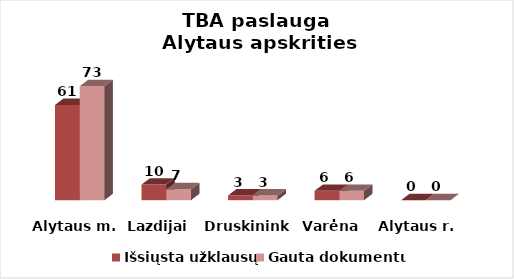
| Category | Išsiųsta užklausų | Gauta dokumentų |
|---|---|---|
| Alytaus m. | 61 | 73 |
| Lazdijai | 10 | 7 |
| Druskininkai | 3 | 3 |
| Varėna | 6 | 6 |
| Alytaus r. | 0 | 0 |